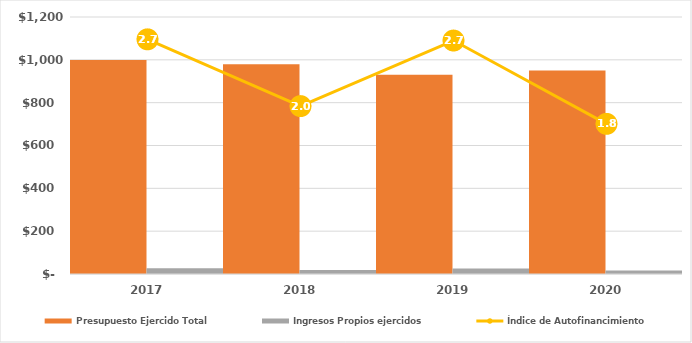
| Category | Presupuesto Ejercido Total | Ingresos Propios ejercidos |
|---|---|---|
| 2017.0 | 998802.519 | 27359.007 |
| 2018.0 | 979910 | 19204 |
| 2019.0 | 930744.078 | 25363.348 |
| 2020.0 | 949931.095 | 16647.959 |